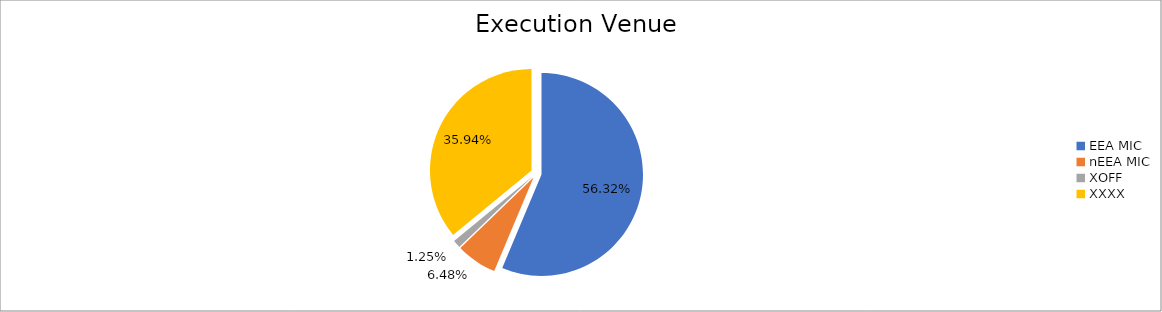
| Category | Series 0 |
|---|---|
| EEA MIC | 5621194.496 |
| nEEA MIC | 646946.566 |
| XOFF | 124965.72 |
| XXXX | 3587204.095 |